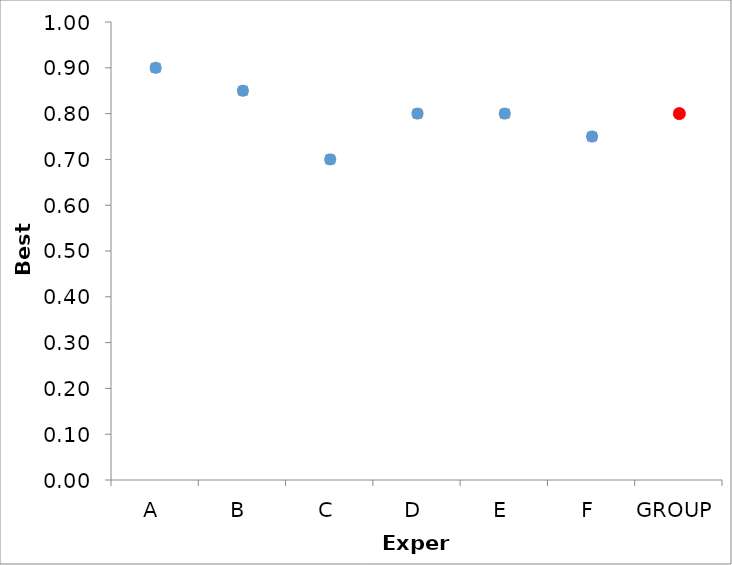
| Category | Series 1 | Series 0 |
|---|---|---|
| A | 0.9 | 0.9 |
| B | 0.85 | 0.85 |
| C | 0.7 | 0.7 |
| D | 0.8 | 0.8 |
| E | 0.8 | 0.8 |
| F | 0.75 | 0.75 |
| GROUP | 0.8 | 0.8 |